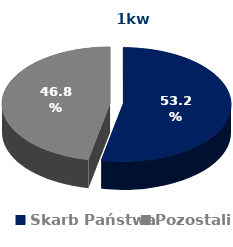
| Category | Struktura akcjonariatu 2011 |
|---|---|
| Skarb Państwa | 0.532 |
| Pozostali | 0.468 |